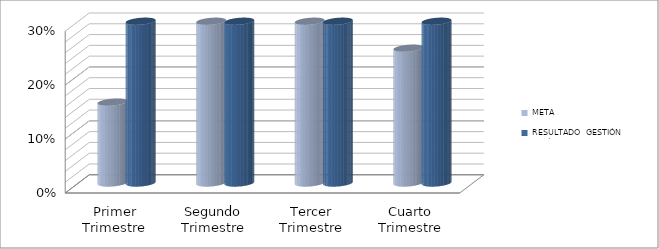
| Category | META | RESULTADO  GESTIÓN PERÍODO |
|---|---|---|
| Primer Trimestre | 0.15 | 1 |
| Segundo Trimestre | 0.3 | 1 |
| Tercer Trimestre | 0.3 | 1 |
| Cuarto Trimestre | 0.25 | 0.96 |